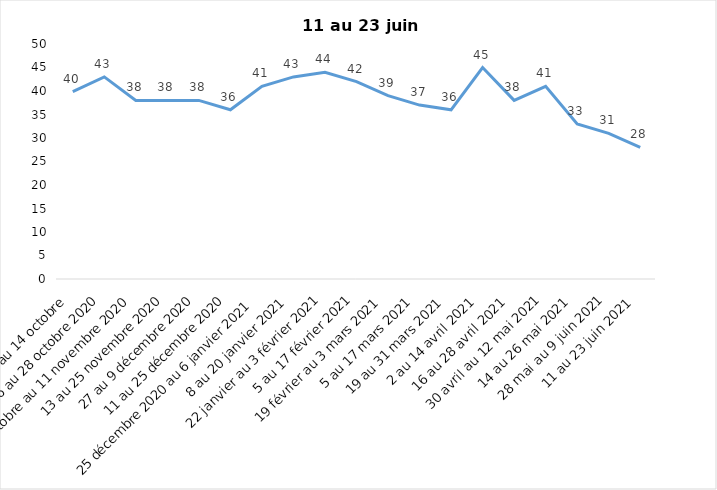
| Category | Toujours aux trois mesures |
|---|---|
| 2 au 14 octobre  | 39.85 |
| 16 au 28 octobre 2020 | 43 |
| 30 octobre au 11 novembre 2020 | 38 |
| 13 au 25 novembre 2020 | 38 |
| 27 au 9 décembre 2020 | 38 |
| 11 au 25 décembre 2020 | 36 |
| 25 décembre 2020 au 6 janvier 2021 | 41 |
| 8 au 20 janvier 2021 | 43 |
| 22 janvier au 3 février 2021 | 44 |
| 5 au 17 février 2021 | 42 |
| 19 février au 3 mars 2021 | 39 |
| 5 au 17 mars 2021 | 37 |
| 19 au 31 mars 2021 | 36 |
| 2 au 14 avril 2021 | 45 |
| 16 au 28 avril 2021 | 38 |
| 30 avril au 12 mai 2021 | 41 |
| 14 au 26 mai 2021 | 33 |
| 28 mai au 9 juin 2021 | 31 |
| 11 au 23 juin 2021 | 28 |